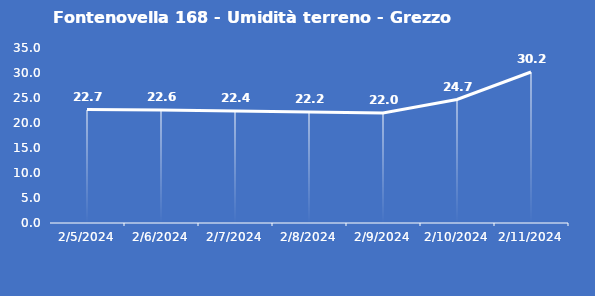
| Category | Fontenovella 168 - Umidità terreno - Grezzo (%VWC) |
|---|---|
| 2/5/24 | 22.7 |
| 2/6/24 | 22.6 |
| 2/7/24 | 22.4 |
| 2/8/24 | 22.2 |
| 2/9/24 | 22 |
| 2/10/24 | 24.7 |
| 2/11/24 | 30.2 |